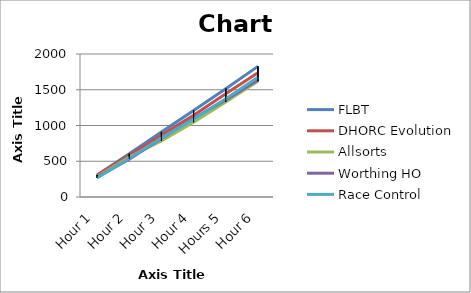
| Category | FLBT | DHORC Evolution | Allsorts | Worthing HO | Race Control |
|---|---|---|---|---|---|
| Hour 1 | 309 | 304 | 282 | 276 | 267 |
| Hour 2 | 604 | 588 | 559 | 530 | 541 |
| Hour 3 | 910 | 866 | 783 | 820 | 826 |
| Hour 4 | 1209 | 1144 | 1045 | 1102 | 1089 |
| Hours 5 | 1514 | 1443 | 1329 | 1358 | 1374 |
| Hour 6 | 1827 | 1738 | 1618 | 1635 | 1675 |